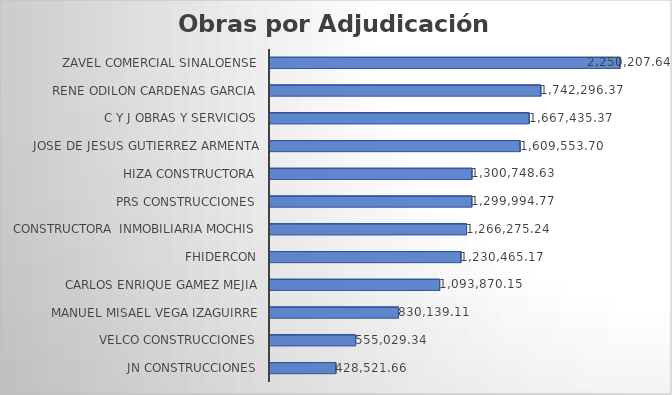
| Category | Suma |
|---|---|
| JN CONSTRUCCIONES | 428521.66 |
| VELCO CONSTRUCCIONES | 555029.341 |
| MANUEL MISAEL VEGA IZAGUIRRE | 830139.106 |
| CARLOS ENRIQUE GAMEZ MEJIA | 1093870.152 |
| FHIDERCON | 1230465.174 |
| CONSTRUCTORA  INMOBILIARIA MOCHIS | 1266275.244 |
| PRS CONSTRUCCIONES | 1299994.772 |
| HIZA CONSTRUCTORA | 1300748.635 |
| JOSE DE JESUS GUTIERREZ ARMENTA | 1609553.696 |
| C Y J OBRAS Y SERVICIOS | 1667435.375 |
| RENE ODILON CARDENAS GARCIA | 1742296.371 |
| ZAVEL COMERCIAL SINALOENSE | 2250207.637 |